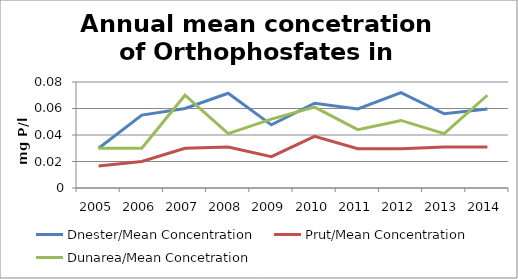
| Category | Dnester/Mean Concentration  | Prut/Mean Concentration | Dunarea/Mean Concetration |
|---|---|---|---|
| 2005.0 | 0.03 | 0.017 | 0.03 |
| 2006.0 | 0.055 | 0.02 | 0.03 |
| 2007.0 | 0.06 | 0.03 | 0.07 |
| 2008.0 | 0.072 | 0.031 | 0.041 |
| 2009.0 | 0.048 | 0.024 | 0.052 |
| 2010.0 | 0.064 | 0.039 | 0.061 |
| 2011.0 | 0.06 | 0.03 | 0.044 |
| 2012.0 | 0.072 | 0.03 | 0.051 |
| 2013.0 | 0.056 | 0.031 | 0.041 |
| 2014.0 | 0.06 | 0.031 | 0.07 |